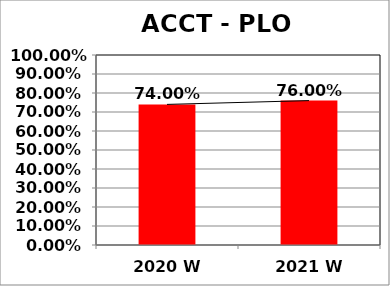
| Category | Series 0 |
|---|---|
| 2020 W | 0.74 |
| 2021 W | 0.76 |